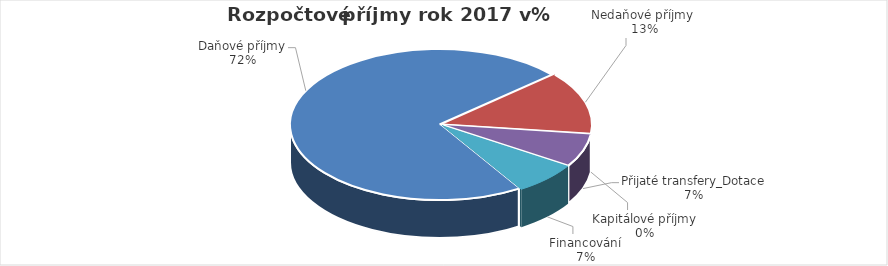
| Category | Series 0 |
|---|---|
| Daňové příjmy | 0.724 |
| Nedaňové příjmy  | 0.134 |
| Kapitálové příjmy | 0 |
| Přijaté transfery_Dotace | 0.071 |
| Financování | 0.071 |